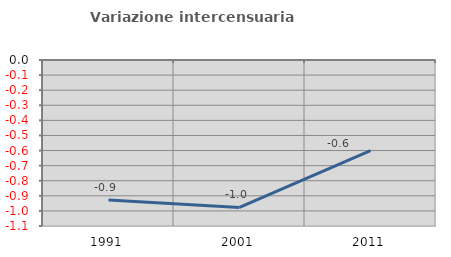
| Category | Variazione intercensuaria annua |
|---|---|
| 1991.0 | -0.927 |
| 2001.0 | -0.977 |
| 2011.0 | -0.601 |